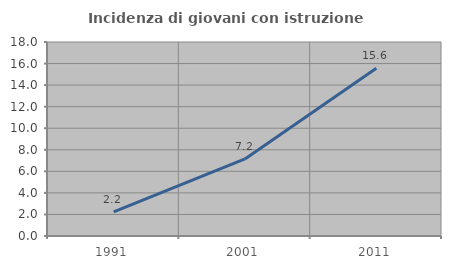
| Category | Incidenza di giovani con istruzione universitaria |
|---|---|
| 1991.0 | 2.232 |
| 2001.0 | 7.151 |
| 2011.0 | 15.57 |